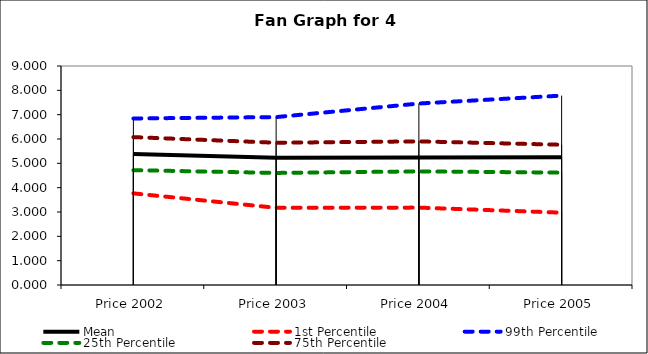
| Category | Mean | 1st Percentile | 99th Percentile | 25th Percentile | 75th Percentile |
|---|---|---|---|---|---|
| Price 2002 | 5.386 | 3.765 | 6.844 | 4.72 | 6.078 |
| Price 2003 | 5.228 | 3.173 | 6.901 | 4.606 | 5.847 |
| Price 2004 | 5.239 | 3.18 | 7.458 | 4.669 | 5.902 |
| Price 2005 | 5.253 | 2.973 | 7.783 | 4.619 | 5.764 |